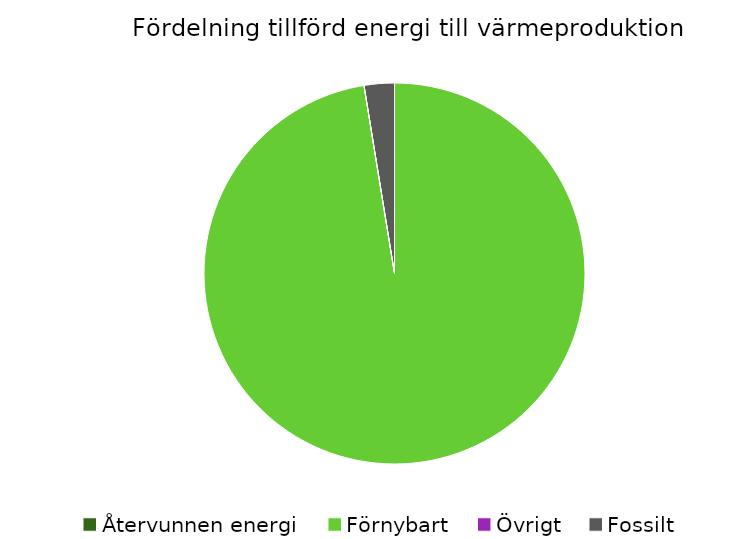
| Category | Fördelning värmeproduktion |
|---|---|
| Återvunnen energi | 0 |
| Förnybart | 0.974 |
| Övrigt | 0 |
| Fossilt | 0.026 |